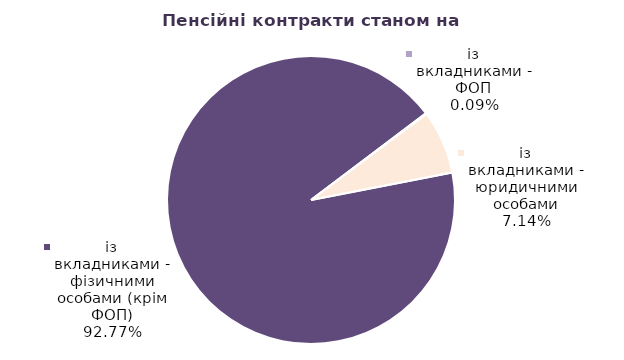
| Category | Series 0 |
|---|---|
| із вкладниками - фізичними особами (крім ФОП) | 86698 |
| із вкладниками - ФОП | 84 |
| із вкладниками - юридичними особами | 6676 |